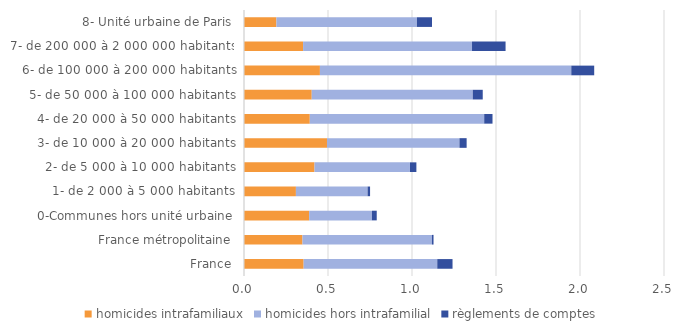
| Category | homicides intrafamiliaux | homicides hors intrafamilial | règlements de comptes |
|---|---|---|---|
| France | 0.355 | 0.795 | 0.091 |
| France métropolitaine | 0.348 | 0.771 | 0.009 |
| 0-Communes hors unité urbaine | 0.388 | 0.373 | 0.029 |
| 1- de 2 000 à 5 000 habitants | 0.309 | 0.427 | 0.015 |
| 2- de 5 000 à 10 000 habitants | 0.42 | 0.568 | 0.038 |
| 3- de 10 000 à 20 000 habitants | 0.494 | 0.788 | 0.043 |
| 4- de 20 000 à 50 000 habitants | 0.392 | 1.038 | 0.049 |
| 5- de 50 000 à 100 000 habitants | 0.403 | 0.958 | 0.059 |
| 6- de 100 000 à 200 000 habitants | 0.452 | 1.496 | 0.136 |
| 7- de 200 000 à 2 000 000 habitants | 0.352 | 1.006 | 0.2 |
| 8- Unité urbaine de Paris | 0.193 | 0.837 | 0.09 |